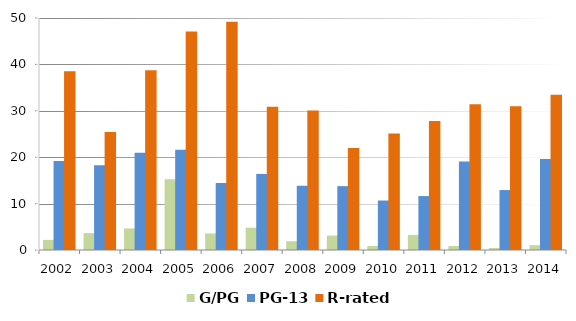
| Category | G/PG | PG-13 | R-rated |
|---|---|---|---|
| 2002.0 | 2.174 | 19.164 | 38.512 |
| 2003.0 | 3.64 | 18.265 | 25.408 |
| 2004.0 | 4.645 | 20.96 | 38.737 |
| 2005.0 | 15.226 | 21.614 | 47.071 |
| 2006.0 | 3.561 | 14.458 | 49.208 |
| 2007.0 | 4.806 | 16.393 | 30.879 |
| 2008.0 | 1.893 | 13.844 | 30.071 |
| 2009.0 | 3.105 | 13.762 | 21.98 |
| 2010.0 | 0.857 | 10.66 | 25.102 |
| 2011.0 | 3.242 | 11.625 | 27.811 |
| 2012.0 | 0.852 | 19.066 | 31.426 |
| 2013.0 | 0.421 | 12.917 | 30.966 |
| 2014.0 | 1.038 | 19.61 | 33.442 |